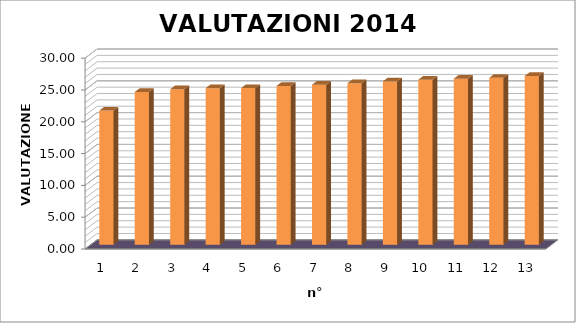
| Category | Series 0 |
|---|---|
| 0 | 21.11 |
| 1 | 24.03 |
| 2 | 24.46 |
| 3 | 24.63 |
| 4 | 24.64 |
| 5 | 24.98 |
| 6 | 25.17 |
| 7 | 25.41 |
| 8 | 25.69 |
| 9 | 25.97 |
| 10 | 26.12 |
| 11 | 26.26 |
| 12 | 26.54 |